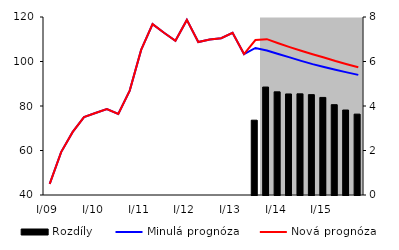
| Category | Rozdíly |
|---|---|
| 0 | 0 |
| 1 | 0 |
| 2 | 0 |
| 3 | 0 |
| 4 | 0 |
| 5 | 0 |
| 6 | 0 |
| 7 | 0 |
| 8 | 0 |
| 9 | 0 |
| 10 | 0 |
| 11 | 0 |
| 12 | 0 |
| 13 | 0 |
| 14 | 0 |
| 15 | 0 |
| 16 | 0 |
| 17 | 0 |
| 18 | 3.363 |
| 19 | 4.852 |
| 20 | 4.637 |
| 21 | 4.541 |
| 22 | 4.547 |
| 23 | 4.511 |
| 24 | 4.385 |
| 25 | 4.059 |
| 26 | 3.819 |
| 27 | 3.635 |